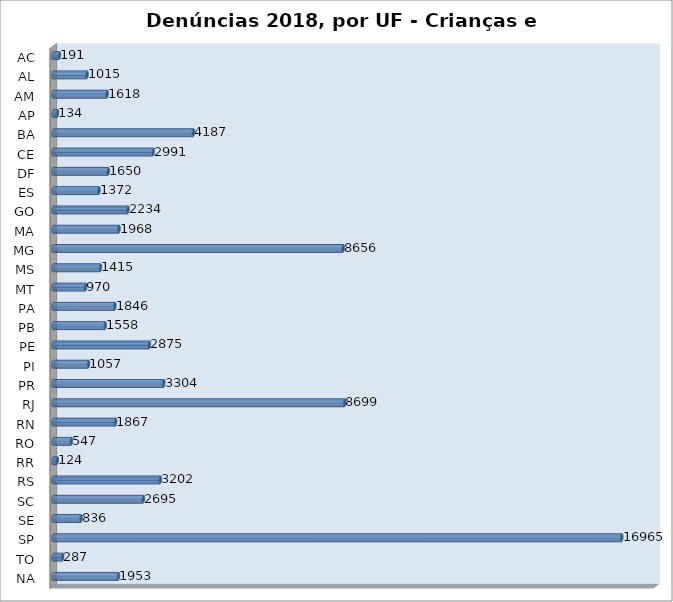
| Category | Series 0 |
|---|---|
| AC | 191 |
| AL | 1015 |
| AM | 1618 |
| AP | 134 |
| BA | 4187 |
| CE | 2991 |
| DF | 1650 |
| ES | 1372 |
| GO | 2234 |
| MA | 1968 |
| MG | 8656 |
| MS | 1415 |
| MT | 970 |
| PA | 1846 |
| PB | 1558 |
| PE | 2875 |
| PI | 1057 |
| PR | 3304 |
| RJ | 8699 |
| RN | 1867 |
| RO | 547 |
| RR | 124 |
| RS | 3202 |
| SC | 2695 |
| SE | 836 |
| SP | 16965 |
| TO | 287 |
| NA | 1953 |